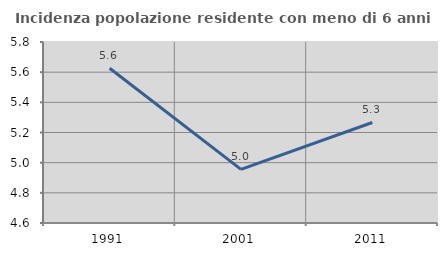
| Category | Incidenza popolazione residente con meno di 6 anni |
|---|---|
| 1991.0 | 5.626 |
| 2001.0 | 4.956 |
| 2011.0 | 5.266 |